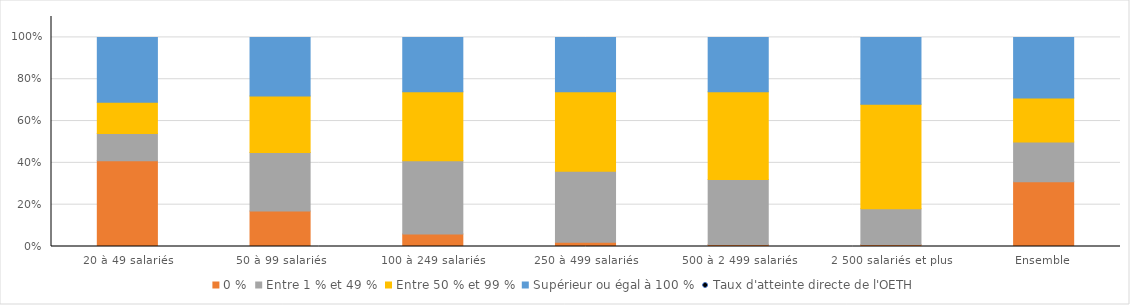
| Category | 0 % | Entre 1 % et 49 % | Entre 50 % et 99 % | Supérieur ou égal à 100 % |
|---|---|---|---|---|
| 20 à 49 salariés | 41 | 13 | 15 | 31 |
| 50 à 99 salariés | 17 | 28 | 27 | 28 |
| 100 à 249 salariés | 6 | 35 | 33 | 26 |
| 250 à 499 salariés | 2 | 34 | 38 | 26 |
| 500 à 2 499 salariés | 1 | 31 | 42 | 26 |
| 2 500 salariés et plus | 1 | 17 | 50 | 32 |
| Ensemble | 31 | 19 | 21 | 29 |